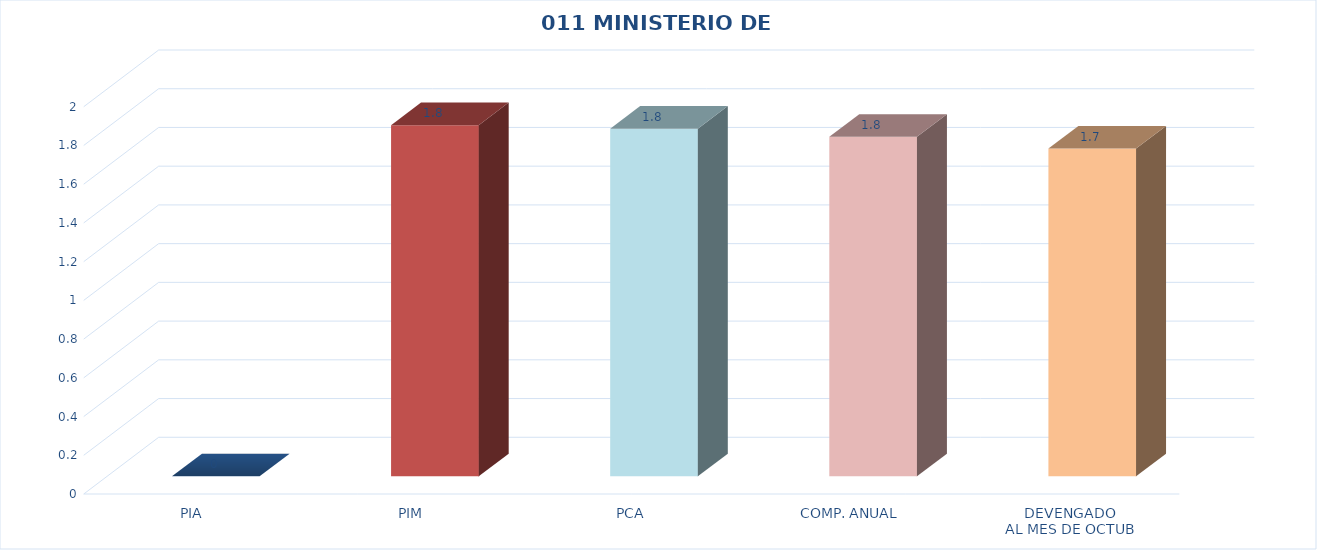
| Category | 011 MINISTERIO DE SALUD |
|---|---|
| PIA | 0 |
| PIM | 1.813 |
| PCA | 1.795 |
| COMP. ANUAL | 1.753 |
| DEVENGADO
AL MES DE OCTUB | 1.692 |